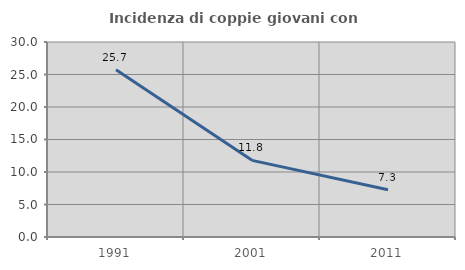
| Category | Incidenza di coppie giovani con figli |
|---|---|
| 1991.0 | 25.714 |
| 2001.0 | 11.792 |
| 2011.0 | 7.258 |